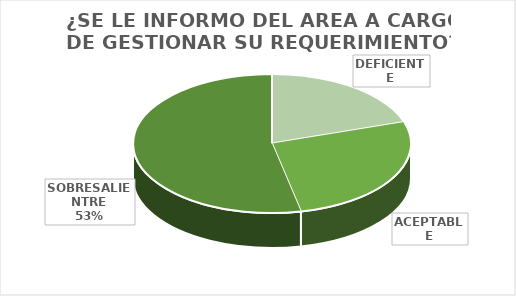
| Category | Series 0 |
|---|---|
| DEFICIENTE | 6 |
| ACEPTABLE | 8 |
| SOBRESALIENTRE | 16 |